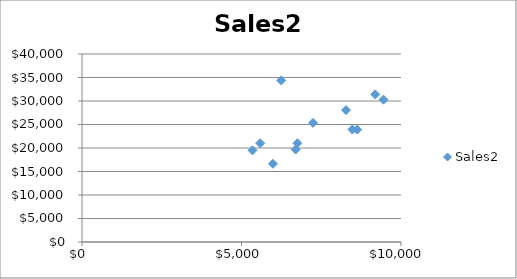
| Category | Sales2 |
|---|---|
| 8627.0 | 23919 |
| 5343.0 | 19507 |
| 6244.0 | 34377 |
| 9451.0 | 30285 |
| 6698.0 | 19673 |
| 6752.0 | 21007 |
| 5985.0 | 16644 |
| 5586.0 | 21022 |
| 8476.0 | 23928 |
| 9191.0 | 31403 |
| 7242.0 | 25333 |
| 8277.0 | 28071 |